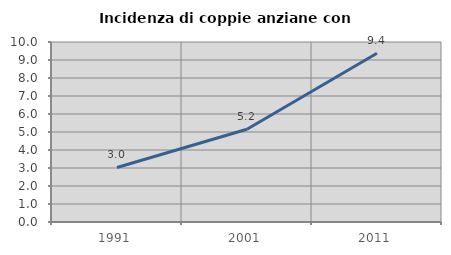
| Category | Incidenza di coppie anziane con figli |
|---|---|
| 1991.0 | 3.03 |
| 2001.0 | 5.155 |
| 2011.0 | 9.375 |